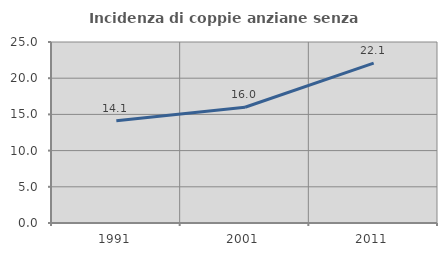
| Category | Incidenza di coppie anziane senza figli  |
|---|---|
| 1991.0 | 14.118 |
| 2001.0 | 15.982 |
| 2011.0 | 22.071 |